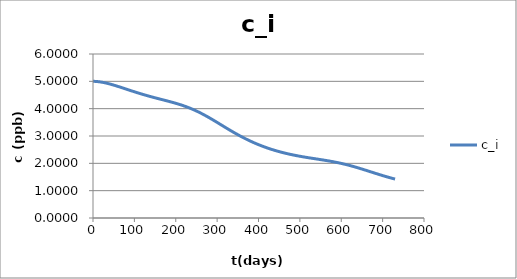
| Category | c_i |
|---|---|
| 0.0 | 5 |
| 1.0 | 5 |
| 2.0 | 5 |
| 3.0 | 4.999 |
| 4.0 | 4.999 |
| 5.0 | 4.998 |
| 6.0 | 4.997 |
| 7.0 | 4.996 |
| 8.0 | 4.995 |
| 9.0 | 4.994 |
| 10.0 | 4.992 |
| 11.0 | 4.991 |
| 12.0 | 4.989 |
| 13.0 | 4.987 |
| 14.0 | 4.986 |
| 15.0 | 4.984 |
| 16.0 | 4.982 |
| 17.0 | 4.979 |
| 18.0 | 4.977 |
| 19.0 | 4.975 |
| 20.0 | 4.972 |
| 21.0 | 4.97 |
| 22.0 | 4.967 |
| 23.0 | 4.964 |
| 24.0 | 4.961 |
| 25.0 | 4.959 |
| 26.0 | 4.956 |
| 27.0 | 4.952 |
| 28.0 | 4.949 |
| 29.0 | 4.946 |
| 30.0 | 4.943 |
| 31.0 | 4.939 |
| 32.0 | 4.936 |
| 33.0 | 4.932 |
| 34.0 | 4.928 |
| 35.0 | 4.925 |
| 36.0 | 4.921 |
| 37.0 | 4.917 |
| 38.0 | 4.913 |
| 39.0 | 4.909 |
| 40.0 | 4.905 |
| 41.0 | 4.901 |
| 42.0 | 4.897 |
| 43.0 | 4.893 |
| 44.0 | 4.889 |
| 45.0 | 4.884 |
| 46.0 | 4.88 |
| 47.0 | 4.876 |
| 48.0 | 4.871 |
| 49.0 | 4.867 |
| 50.0 | 4.862 |
| 51.0 | 4.858 |
| 52.0 | 4.853 |
| 53.0 | 4.849 |
| 54.0 | 4.844 |
| 55.0 | 4.839 |
| 56.0 | 4.835 |
| 57.0 | 4.83 |
| 58.0 | 4.825 |
| 59.0 | 4.821 |
| 60.0 | 4.816 |
| 61.0 | 4.811 |
| 62.0 | 4.806 |
| 63.0 | 4.801 |
| 64.0 | 4.796 |
| 65.0 | 4.791 |
| 66.0 | 4.787 |
| 67.0 | 4.782 |
| 68.0 | 4.777 |
| 69.0 | 4.772 |
| 70.0 | 4.767 |
| 71.0 | 4.762 |
| 72.0 | 4.757 |
| 73.0 | 4.752 |
| 74.0 | 4.747 |
| 75.0 | 4.742 |
| 76.0 | 4.737 |
| 77.0 | 4.732 |
| 78.0 | 4.727 |
| 79.0 | 4.722 |
| 80.0 | 4.717 |
| 81.0 | 4.712 |
| 82.0 | 4.707 |
| 83.0 | 4.702 |
| 84.0 | 4.697 |
| 85.0 | 4.692 |
| 86.0 | 4.687 |
| 87.0 | 4.682 |
| 88.0 | 4.677 |
| 89.0 | 4.672 |
| 90.0 | 4.667 |
| 91.0 | 4.662 |
| 92.0 | 4.657 |
| 93.0 | 4.652 |
| 94.0 | 4.647 |
| 95.0 | 4.642 |
| 96.0 | 4.638 |
| 97.0 | 4.633 |
| 98.0 | 4.628 |
| 99.0 | 4.623 |
| 100.0 | 4.618 |
| 101.0 | 4.613 |
| 102.0 | 4.608 |
| 103.0 | 4.604 |
| 104.0 | 4.599 |
| 105.0 | 4.594 |
| 106.0 | 4.589 |
| 107.0 | 4.585 |
| 108.0 | 4.58 |
| 109.0 | 4.575 |
| 110.0 | 4.57 |
| 111.0 | 4.566 |
| 112.0 | 4.561 |
| 113.0 | 4.556 |
| 114.0 | 4.552 |
| 115.0 | 4.547 |
| 116.0 | 4.543 |
| 117.0 | 4.538 |
| 118.0 | 4.533 |
| 119.0 | 4.529 |
| 120.0 | 4.524 |
| 121.0 | 4.52 |
| 122.0 | 4.515 |
| 123.0 | 4.511 |
| 124.0 | 4.507 |
| 125.0 | 4.502 |
| 126.0 | 4.498 |
| 127.0 | 4.493 |
| 128.0 | 4.489 |
| 129.0 | 4.485 |
| 130.0 | 4.48 |
| 131.0 | 4.476 |
| 132.0 | 4.472 |
| 133.0 | 4.468 |
| 134.0 | 4.463 |
| 135.0 | 4.459 |
| 136.0 | 4.455 |
| 137.0 | 4.451 |
| 138.0 | 4.447 |
| 139.0 | 4.442 |
| 140.0 | 4.438 |
| 141.0 | 4.434 |
| 142.0 | 4.43 |
| 143.0 | 4.426 |
| 144.0 | 4.422 |
| 145.0 | 4.418 |
| 146.0 | 4.414 |
| 147.0 | 4.41 |
| 148.0 | 4.406 |
| 149.0 | 4.402 |
| 150.0 | 4.398 |
| 151.0 | 4.394 |
| 152.0 | 4.39 |
| 153.0 | 4.386 |
| 154.0 | 4.382 |
| 155.0 | 4.378 |
| 156.0 | 4.374 |
| 157.0 | 4.37 |
| 158.0 | 4.366 |
| 159.0 | 4.362 |
| 160.0 | 4.358 |
| 161.0 | 4.354 |
| 162.0 | 4.35 |
| 163.0 | 4.347 |
| 164.0 | 4.343 |
| 165.0 | 4.339 |
| 166.0 | 4.335 |
| 167.0 | 4.331 |
| 168.0 | 4.327 |
| 169.0 | 4.323 |
| 170.0 | 4.319 |
| 171.0 | 4.315 |
| 172.0 | 4.312 |
| 173.0 | 4.308 |
| 174.0 | 4.304 |
| 175.0 | 4.3 |
| 176.0 | 4.296 |
| 177.0 | 4.292 |
| 178.0 | 4.288 |
| 179.0 | 4.284 |
| 180.0 | 4.28 |
| 181.0 | 4.276 |
| 182.0 | 4.272 |
| 183.0 | 4.268 |
| 184.0 | 4.264 |
| 185.0 | 4.26 |
| 186.0 | 4.256 |
| 187.0 | 4.252 |
| 188.0 | 4.248 |
| 189.0 | 4.244 |
| 190.0 | 4.24 |
| 191.0 | 4.235 |
| 192.0 | 4.231 |
| 193.0 | 4.227 |
| 194.0 | 4.223 |
| 195.0 | 4.219 |
| 196.0 | 4.214 |
| 197.0 | 4.21 |
| 198.0 | 4.206 |
| 199.0 | 4.201 |
| 200.0 | 4.197 |
| 201.0 | 4.192 |
| 202.0 | 4.188 |
| 203.0 | 4.183 |
| 204.0 | 4.179 |
| 205.0 | 4.174 |
| 206.0 | 4.17 |
| 207.0 | 4.165 |
| 208.0 | 4.16 |
| 209.0 | 4.155 |
| 210.0 | 4.151 |
| 211.0 | 4.146 |
| 212.0 | 4.141 |
| 213.0 | 4.136 |
| 214.0 | 4.131 |
| 215.0 | 4.126 |
| 216.0 | 4.121 |
| 217.0 | 4.116 |
| 218.0 | 4.111 |
| 219.0 | 4.105 |
| 220.0 | 4.1 |
| 221.0 | 4.095 |
| 222.0 | 4.089 |
| 223.0 | 4.084 |
| 224.0 | 4.078 |
| 225.0 | 4.073 |
| 226.0 | 4.067 |
| 227.0 | 4.061 |
| 228.0 | 4.056 |
| 229.0 | 4.05 |
| 230.0 | 4.044 |
| 231.0 | 4.038 |
| 232.0 | 4.032 |
| 233.0 | 4.026 |
| 234.0 | 4.02 |
| 235.0 | 4.014 |
| 236.0 | 4.008 |
| 237.0 | 4.002 |
| 238.0 | 3.995 |
| 239.0 | 3.989 |
| 240.0 | 3.982 |
| 241.0 | 3.976 |
| 242.0 | 3.969 |
| 243.0 | 3.963 |
| 244.0 | 3.956 |
| 245.0 | 3.949 |
| 246.0 | 3.942 |
| 247.0 | 3.936 |
| 248.0 | 3.929 |
| 249.0 | 3.922 |
| 250.0 | 3.915 |
| 251.0 | 3.907 |
| 252.0 | 3.9 |
| 253.0 | 3.893 |
| 254.0 | 3.886 |
| 255.0 | 3.878 |
| 256.0 | 3.871 |
| 257.0 | 3.863 |
| 258.0 | 3.856 |
| 259.0 | 3.848 |
| 260.0 | 3.841 |
| 261.0 | 3.833 |
| 262.0 | 3.825 |
| 263.0 | 3.817 |
| 264.0 | 3.809 |
| 265.0 | 3.801 |
| 266.0 | 3.793 |
| 267.0 | 3.785 |
| 268.0 | 3.777 |
| 269.0 | 3.769 |
| 270.0 | 3.761 |
| 271.0 | 3.753 |
| 272.0 | 3.744 |
| 273.0 | 3.736 |
| 274.0 | 3.728 |
| 275.0 | 3.719 |
| 276.0 | 3.711 |
| 277.0 | 3.702 |
| 278.0 | 3.694 |
| 279.0 | 3.685 |
| 280.0 | 3.676 |
| 281.0 | 3.668 |
| 282.0 | 3.659 |
| 283.0 | 3.65 |
| 284.0 | 3.641 |
| 285.0 | 3.633 |
| 286.0 | 3.624 |
| 287.0 | 3.615 |
| 288.0 | 3.606 |
| 289.0 | 3.597 |
| 290.0 | 3.588 |
| 291.0 | 3.579 |
| 292.0 | 3.57 |
| 293.0 | 3.561 |
| 294.0 | 3.552 |
| 295.0 | 3.543 |
| 296.0 | 3.534 |
| 297.0 | 3.525 |
| 298.0 | 3.515 |
| 299.0 | 3.506 |
| 300.0 | 3.497 |
| 301.0 | 3.488 |
| 302.0 | 3.479 |
| 303.0 | 3.47 |
| 304.0 | 3.46 |
| 305.0 | 3.451 |
| 306.0 | 3.442 |
| 307.0 | 3.433 |
| 308.0 | 3.423 |
| 309.0 | 3.414 |
| 310.0 | 3.405 |
| 311.0 | 3.396 |
| 312.0 | 3.386 |
| 313.0 | 3.377 |
| 314.0 | 3.368 |
| 315.0 | 3.359 |
| 316.0 | 3.349 |
| 317.0 | 3.34 |
| 318.0 | 3.331 |
| 319.0 | 3.322 |
| 320.0 | 3.313 |
| 321.0 | 3.304 |
| 322.0 | 3.294 |
| 323.0 | 3.285 |
| 324.0 | 3.276 |
| 325.0 | 3.267 |
| 326.0 | 3.258 |
| 327.0 | 3.249 |
| 328.0 | 3.24 |
| 329.0 | 3.231 |
| 330.0 | 3.222 |
| 331.0 | 3.213 |
| 332.0 | 3.204 |
| 333.0 | 3.195 |
| 334.0 | 3.186 |
| 335.0 | 3.177 |
| 336.0 | 3.168 |
| 337.0 | 3.16 |
| 338.0 | 3.151 |
| 339.0 | 3.142 |
| 340.0 | 3.133 |
| 341.0 | 3.125 |
| 342.0 | 3.116 |
| 343.0 | 3.107 |
| 344.0 | 3.099 |
| 345.0 | 3.09 |
| 346.0 | 3.082 |
| 347.0 | 3.073 |
| 348.0 | 3.065 |
| 349.0 | 3.056 |
| 350.0 | 3.048 |
| 351.0 | 3.039 |
| 352.0 | 3.031 |
| 353.0 | 3.023 |
| 354.0 | 3.015 |
| 355.0 | 3.006 |
| 356.0 | 2.998 |
| 357.0 | 2.99 |
| 358.0 | 2.982 |
| 359.0 | 2.974 |
| 360.0 | 2.966 |
| 361.0 | 2.958 |
| 362.0 | 2.95 |
| 363.0 | 2.943 |
| 364.0 | 2.935 |
| 365.0 | 2.927 |
| 366.0 | 2.919 |
| 367.0 | 2.912 |
| 368.0 | 2.904 |
| 369.0 | 2.896 |
| 370.0 | 2.889 |
| 371.0 | 2.881 |
| 372.0 | 2.874 |
| 373.0 | 2.866 |
| 374.0 | 2.859 |
| 375.0 | 2.852 |
| 376.0 | 2.845 |
| 377.0 | 2.837 |
| 378.0 | 2.83 |
| 379.0 | 2.823 |
| 380.0 | 2.816 |
| 381.0 | 2.809 |
| 382.0 | 2.802 |
| 383.0 | 2.795 |
| 384.0 | 2.788 |
| 385.0 | 2.781 |
| 386.0 | 2.774 |
| 387.0 | 2.768 |
| 388.0 | 2.761 |
| 389.0 | 2.754 |
| 390.0 | 2.748 |
| 391.0 | 2.741 |
| 392.0 | 2.734 |
| 393.0 | 2.728 |
| 394.0 | 2.722 |
| 395.0 | 2.715 |
| 396.0 | 2.709 |
| 397.0 | 2.702 |
| 398.0 | 2.696 |
| 399.0 | 2.69 |
| 400.0 | 2.684 |
| 401.0 | 2.678 |
| 402.0 | 2.672 |
| 403.0 | 2.666 |
| 404.0 | 2.66 |
| 405.0 | 2.654 |
| 406.0 | 2.648 |
| 407.0 | 2.642 |
| 408.0 | 2.636 |
| 409.0 | 2.63 |
| 410.0 | 2.625 |
| 411.0 | 2.619 |
| 412.0 | 2.613 |
| 413.0 | 2.608 |
| 414.0 | 2.602 |
| 415.0 | 2.597 |
| 416.0 | 2.591 |
| 417.0 | 2.586 |
| 418.0 | 2.58 |
| 419.0 | 2.575 |
| 420.0 | 2.57 |
| 421.0 | 2.564 |
| 422.0 | 2.559 |
| 423.0 | 2.554 |
| 424.0 | 2.549 |
| 425.0 | 2.544 |
| 426.0 | 2.539 |
| 427.0 | 2.534 |
| 428.0 | 2.529 |
| 429.0 | 2.524 |
| 430.0 | 2.519 |
| 431.0 | 2.514 |
| 432.0 | 2.509 |
| 433.0 | 2.504 |
| 434.0 | 2.499 |
| 435.0 | 2.495 |
| 436.0 | 2.49 |
| 437.0 | 2.485 |
| 438.0 | 2.481 |
| 439.0 | 2.476 |
| 440.0 | 2.472 |
| 441.0 | 2.467 |
| 442.0 | 2.463 |
| 443.0 | 2.458 |
| 444.0 | 2.454 |
| 445.0 | 2.45 |
| 446.0 | 2.445 |
| 447.0 | 2.441 |
| 448.0 | 2.437 |
| 449.0 | 2.433 |
| 450.0 | 2.428 |
| 451.0 | 2.424 |
| 452.0 | 2.42 |
| 453.0 | 2.416 |
| 454.0 | 2.412 |
| 455.0 | 2.408 |
| 456.0 | 2.404 |
| 457.0 | 2.4 |
| 458.0 | 2.396 |
| 459.0 | 2.392 |
| 460.0 | 2.389 |
| 461.0 | 2.385 |
| 462.0 | 2.381 |
| 463.0 | 2.377 |
| 464.0 | 2.374 |
| 465.0 | 2.37 |
| 466.0 | 2.366 |
| 467.0 | 2.363 |
| 468.0 | 2.359 |
| 469.0 | 2.356 |
| 470.0 | 2.352 |
| 471.0 | 2.349 |
| 472.0 | 2.345 |
| 473.0 | 2.342 |
| 474.0 | 2.338 |
| 475.0 | 2.335 |
| 476.0 | 2.332 |
| 477.0 | 2.328 |
| 478.0 | 2.325 |
| 479.0 | 2.322 |
| 480.0 | 2.318 |
| 481.0 | 2.315 |
| 482.0 | 2.312 |
| 483.0 | 2.309 |
| 484.0 | 2.306 |
| 485.0 | 2.303 |
| 486.0 | 2.3 |
| 487.0 | 2.296 |
| 488.0 | 2.293 |
| 489.0 | 2.29 |
| 490.0 | 2.287 |
| 491.0 | 2.285 |
| 492.0 | 2.282 |
| 493.0 | 2.279 |
| 494.0 | 2.276 |
| 495.0 | 2.273 |
| 496.0 | 2.27 |
| 497.0 | 2.267 |
| 498.0 | 2.264 |
| 499.0 | 2.262 |
| 500.0 | 2.259 |
| 501.0 | 2.256 |
| 502.0 | 2.253 |
| 503.0 | 2.251 |
| 504.0 | 2.248 |
| 505.0 | 2.245 |
| 506.0 | 2.243 |
| 507.0 | 2.24 |
| 508.0 | 2.237 |
| 509.0 | 2.235 |
| 510.0 | 2.232 |
| 511.0 | 2.23 |
| 512.0 | 2.227 |
| 513.0 | 2.225 |
| 514.0 | 2.222 |
| 515.0 | 2.22 |
| 516.0 | 2.217 |
| 517.0 | 2.215 |
| 518.0 | 2.212 |
| 519.0 | 2.21 |
| 520.0 | 2.207 |
| 521.0 | 2.205 |
| 522.0 | 2.202 |
| 523.0 | 2.2 |
| 524.0 | 2.198 |
| 525.0 | 2.195 |
| 526.0 | 2.193 |
| 527.0 | 2.191 |
| 528.0 | 2.188 |
| 529.0 | 2.186 |
| 530.0 | 2.183 |
| 531.0 | 2.181 |
| 532.0 | 2.179 |
| 533.0 | 2.176 |
| 534.0 | 2.174 |
| 535.0 | 2.172 |
| 536.0 | 2.169 |
| 537.0 | 2.167 |
| 538.0 | 2.165 |
| 539.0 | 2.162 |
| 540.0 | 2.16 |
| 541.0 | 2.158 |
| 542.0 | 2.155 |
| 543.0 | 2.153 |
| 544.0 | 2.151 |
| 545.0 | 2.148 |
| 546.0 | 2.146 |
| 547.0 | 2.144 |
| 548.0 | 2.141 |
| 549.0 | 2.139 |
| 550.0 | 2.137 |
| 551.0 | 2.134 |
| 552.0 | 2.132 |
| 553.0 | 2.129 |
| 554.0 | 2.127 |
| 555.0 | 2.125 |
| 556.0 | 2.122 |
| 557.0 | 2.12 |
| 558.0 | 2.117 |
| 559.0 | 2.115 |
| 560.0 | 2.112 |
| 561.0 | 2.11 |
| 562.0 | 2.108 |
| 563.0 | 2.105 |
| 564.0 | 2.103 |
| 565.0 | 2.1 |
| 566.0 | 2.097 |
| 567.0 | 2.095 |
| 568.0 | 2.092 |
| 569.0 | 2.09 |
| 570.0 | 2.087 |
| 571.0 | 2.084 |
| 572.0 | 2.082 |
| 573.0 | 2.079 |
| 574.0 | 2.076 |
| 575.0 | 2.074 |
| 576.0 | 2.071 |
| 577.0 | 2.068 |
| 578.0 | 2.065 |
| 579.0 | 2.063 |
| 580.0 | 2.06 |
| 581.0 | 2.057 |
| 582.0 | 2.054 |
| 583.0 | 2.051 |
| 584.0 | 2.048 |
| 585.0 | 2.045 |
| 586.0 | 2.042 |
| 587.0 | 2.039 |
| 588.0 | 2.036 |
| 589.0 | 2.033 |
| 590.0 | 2.03 |
| 591.0 | 2.027 |
| 592.0 | 2.024 |
| 593.0 | 2.02 |
| 594.0 | 2.017 |
| 595.0 | 2.014 |
| 596.0 | 2.011 |
| 597.0 | 2.007 |
| 598.0 | 2.004 |
| 599.0 | 2.001 |
| 600.0 | 1.997 |
| 601.0 | 1.994 |
| 602.0 | 1.99 |
| 603.0 | 1.987 |
| 604.0 | 1.983 |
| 605.0 | 1.98 |
| 606.0 | 1.976 |
| 607.0 | 1.973 |
| 608.0 | 1.969 |
| 609.0 | 1.965 |
| 610.0 | 1.962 |
| 611.0 | 1.958 |
| 612.0 | 1.954 |
| 613.0 | 1.95 |
| 614.0 | 1.947 |
| 615.0 | 1.943 |
| 616.0 | 1.939 |
| 617.0 | 1.935 |
| 618.0 | 1.931 |
| 619.0 | 1.927 |
| 620.0 | 1.923 |
| 621.0 | 1.919 |
| 622.0 | 1.915 |
| 623.0 | 1.911 |
| 624.0 | 1.907 |
| 625.0 | 1.903 |
| 626.0 | 1.898 |
| 627.0 | 1.894 |
| 628.0 | 1.89 |
| 629.0 | 1.886 |
| 630.0 | 1.881 |
| 631.0 | 1.877 |
| 632.0 | 1.873 |
| 633.0 | 1.868 |
| 634.0 | 1.864 |
| 635.0 | 1.86 |
| 636.0 | 1.855 |
| 637.0 | 1.851 |
| 638.0 | 1.846 |
| 639.0 | 1.842 |
| 640.0 | 1.837 |
| 641.0 | 1.833 |
| 642.0 | 1.828 |
| 643.0 | 1.824 |
| 644.0 | 1.819 |
| 645.0 | 1.814 |
| 646.0 | 1.81 |
| 647.0 | 1.805 |
| 648.0 | 1.8 |
| 649.0 | 1.796 |
| 650.0 | 1.791 |
| 651.0 | 1.786 |
| 652.0 | 1.782 |
| 653.0 | 1.777 |
| 654.0 | 1.772 |
| 655.0 | 1.767 |
| 656.0 | 1.763 |
| 657.0 | 1.758 |
| 658.0 | 1.753 |
| 659.0 | 1.748 |
| 660.0 | 1.743 |
| 661.0 | 1.739 |
| 662.0 | 1.734 |
| 663.0 | 1.729 |
| 664.0 | 1.724 |
| 665.0 | 1.719 |
| 666.0 | 1.714 |
| 667.0 | 1.71 |
| 668.0 | 1.705 |
| 669.0 | 1.7 |
| 670.0 | 1.695 |
| 671.0 | 1.69 |
| 672.0 | 1.685 |
| 673.0 | 1.681 |
| 674.0 | 1.676 |
| 675.0 | 1.671 |
| 676.0 | 1.666 |
| 677.0 | 1.661 |
| 678.0 | 1.656 |
| 679.0 | 1.651 |
| 680.0 | 1.647 |
| 681.0 | 1.642 |
| 682.0 | 1.637 |
| 683.0 | 1.632 |
| 684.0 | 1.627 |
| 685.0 | 1.623 |
| 686.0 | 1.618 |
| 687.0 | 1.613 |
| 688.0 | 1.608 |
| 689.0 | 1.604 |
| 690.0 | 1.599 |
| 691.0 | 1.594 |
| 692.0 | 1.59 |
| 693.0 | 1.585 |
| 694.0 | 1.58 |
| 695.0 | 1.576 |
| 696.0 | 1.571 |
| 697.0 | 1.566 |
| 698.0 | 1.562 |
| 699.0 | 1.557 |
| 700.0 | 1.552 |
| 701.0 | 1.548 |
| 702.0 | 1.543 |
| 703.0 | 1.539 |
| 704.0 | 1.534 |
| 705.0 | 1.53 |
| 706.0 | 1.525 |
| 707.0 | 1.521 |
| 708.0 | 1.516 |
| 709.0 | 1.512 |
| 710.0 | 1.508 |
| 711.0 | 1.503 |
| 712.0 | 1.499 |
| 713.0 | 1.495 |
| 714.0 | 1.49 |
| 715.0 | 1.486 |
| 716.0 | 1.482 |
| 717.0 | 1.477 |
| 718.0 | 1.473 |
| 719.0 | 1.469 |
| 720.0 | 1.465 |
| 721.0 | 1.461 |
| 722.0 | 1.456 |
| 723.0 | 1.452 |
| 724.0 | 1.448 |
| 725.0 | 1.444 |
| 726.0 | 1.44 |
| 727.0 | 1.436 |
| 728.0 | 1.432 |
| 729.0 | 1.428 |
| 730.0 | 1.424 |